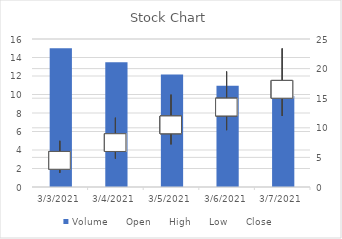
| Category | Volume |
|---|---|
| 3/3/21 | 15 |
| 3/4/21 | 13.5 |
| 3/5/21 | 12.15 |
| 3/6/21 | 10.935 |
| 3/7/21 | 9.842 |